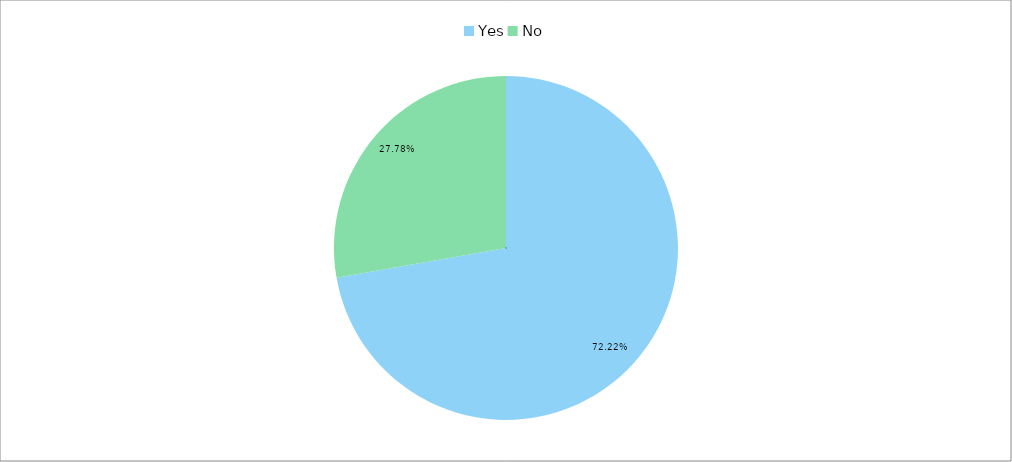
| Category | Total (% & freq col) |
|---|---|
| Yes | 0.722 |
| No | 0.278 |